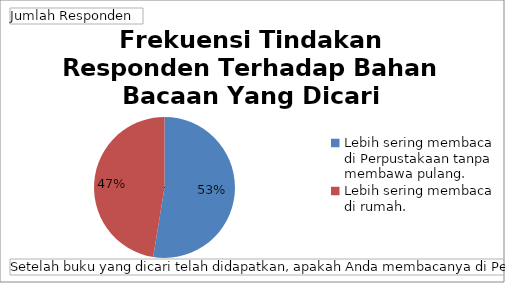
| Category | Total |
|---|---|
| Lebih sering membaca di Perpustakaan tanpa membawa pulang. | 41 |
| Lebih sering membaca di rumah. | 37 |